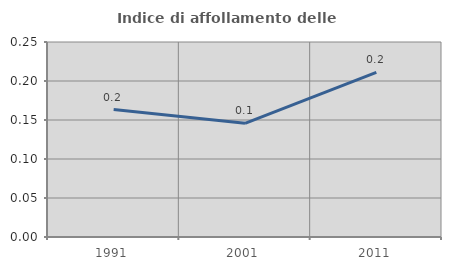
| Category | Indice di affollamento delle abitazioni  |
|---|---|
| 1991.0 | 0.163 |
| 2001.0 | 0.146 |
| 2011.0 | 0.211 |